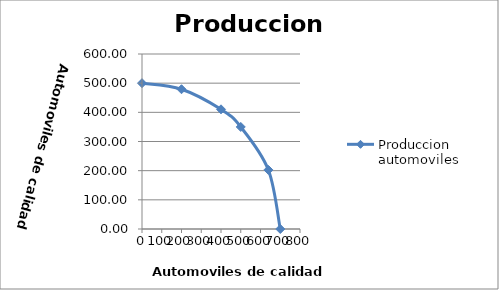
| Category | Produccion automoviles |
|---|---|
| 0.0 | 500 |
| 200.0 | 479.157 |
| 400.0 | 410.326 |
| 500.0 | 349.927 |
| 640.0 | 202.535 |
| 700.0 | 0 |